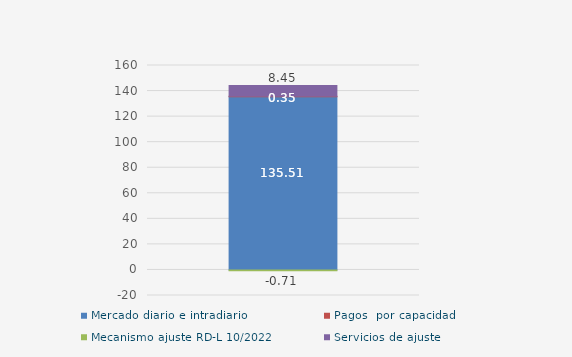
| Category | Mercado diario e intradiario | Pagos  por capacidad | Mecanismo ajuste RD-L 10/2022 | Servicios de ajuste |
|---|---|---|---|---|
| 0 | 135.51 | 0.35 | -0.71 | 8.45 |